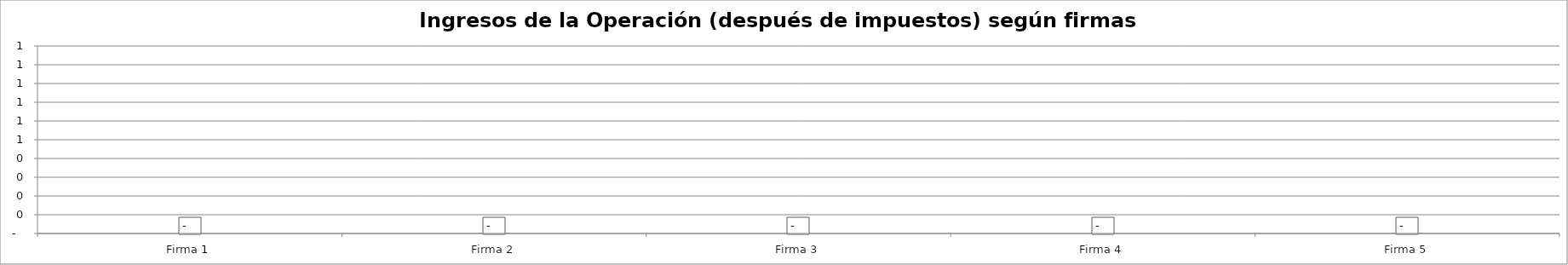
| Category | Ingresos de la Operación (después de impuestos) según firmas simuladas - Año 5 |
|---|---|
| Firma 1 | 0 |
| Firma 2 | 0 |
| Firma 3 | 0 |
| Firma 4 | 0 |
| Firma 5 | 0 |